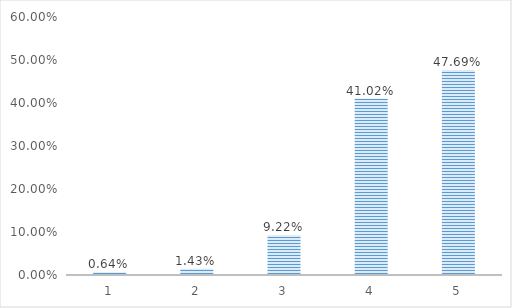
| Category | Series 0 |
|---|---|
| 1.0 | 0.006 |
| 2.0 | 0.014 |
| 3.0 | 0.092 |
| 4.0 | 0.41 |
| 5.0 | 0.477 |